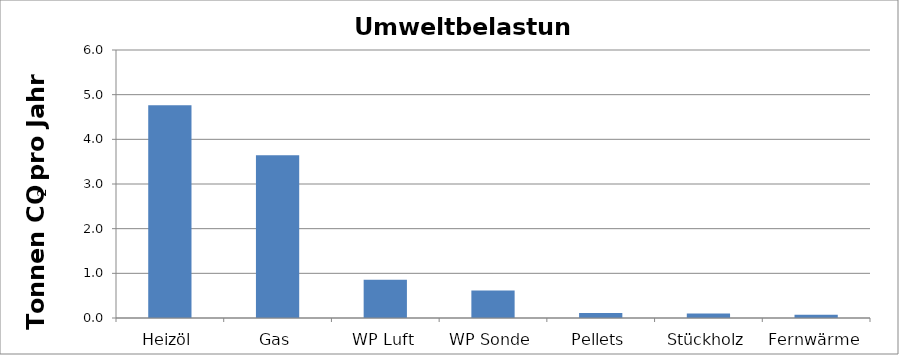
| Category | Umweltbelastung |
|---|---|
| Heizöl | 4.763 |
| Gas | 3.646 |
| WP Luft | 0.855 |
| WP Sonde | 0.618 |
| Pellets | 0.11 |
| Stückholz | 0.098 |
| Fernwärme | 0.074 |